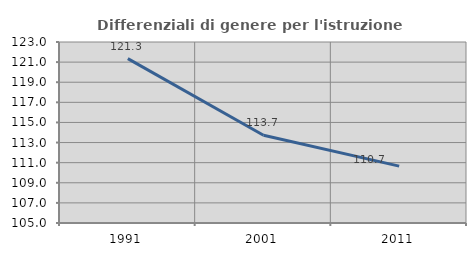
| Category | Differenziali di genere per l'istruzione superiore |
|---|---|
| 1991.0 | 121.349 |
| 2001.0 | 113.73 |
| 2011.0 | 110.657 |